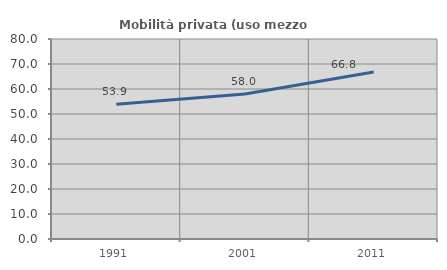
| Category | Mobilità privata (uso mezzo privato) |
|---|---|
| 1991.0 | 53.908 |
| 2001.0 | 58.02 |
| 2011.0 | 66.817 |